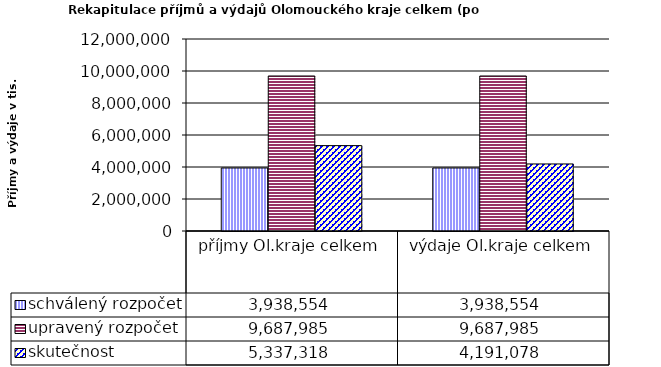
| Category | schválený rozpočet | upravený rozpočet | skutečnost |
|---|---|---|---|
| příjmy Ol.kraje celkem | 3938554 | 9687985 | 5337318 |
| výdaje Ol.kraje celkem | 3938554 | 9687985 | 4191078 |